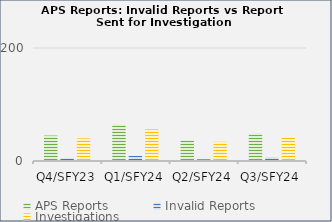
| Category | APS Reports | Invalid Reports | Investigations |
|---|---|---|---|
| Q4/SFY23 | 45 | 5 | 40 |
| Q1/SFY24 | 65 | 9 | 56 |
| Q2/SFY24 | 37 | 3 | 34 |
| Q3/SFY24 | 49 | 7 | 42 |